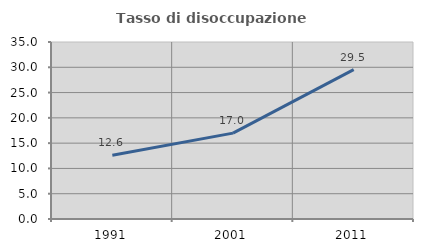
| Category | Tasso di disoccupazione giovanile  |
|---|---|
| 1991.0 | 12.613 |
| 2001.0 | 16.981 |
| 2011.0 | 29.545 |